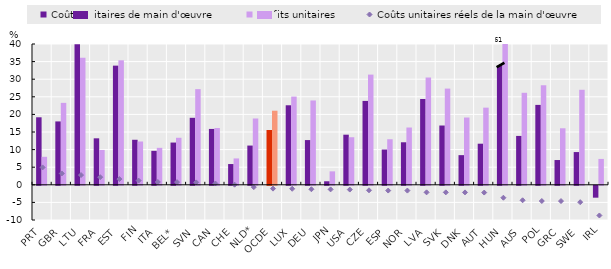
| Category | Coûts unitaires de main d'œuvre | Profits unitaires |
|---|---|---|
| PRT | 19.181 | 7.953 |
| GBR | 18.005 | 23.279 |
| LTU | 39.9 | 36.075 |
| FRA | 13.206 | 9.9 |
| EST | 33.853 | 35.366 |
| FIN | 12.792 | 12.3 |
| ITA | 9.651 | 10.501 |
| BEL* | 12.003 | 13.361 |
| SVN | 19.031 | 27.177 |
| CAN | 15.869 | 16.137 |
| CHE | 5.896 | 7.49 |
| NLD* | 11.147 | 18.838 |
| OCDE | 15.576 | 21.045 |
| LUX | 22.593 | 25.067 |
| DEU | 12.707 | 23.959 |
| JPN | 1.003 | 3.82 |
| USA | 14.237 | 13.516 |
| CZE | 23.831 | 31.305 |
| ESP | 10.021 | 12.941 |
| NOR | 12.082 | 16.273 |
| LVA | 24.37 | 30.481 |
| SVK | 16.842 | 27.333 |
| DNK | 8.426 | 19.111 |
| AUT | 11.676 | 21.916 |
| HUN | 33.829 | 61.382 |
| AUS | 13.884 | 26.135 |
| POL | 22.699 | 28.281 |
| GRC | 7.037 | 16.058 |
| SWE | 9.301 | 26.993 |
| IRL | -3.376 | 7.35 |